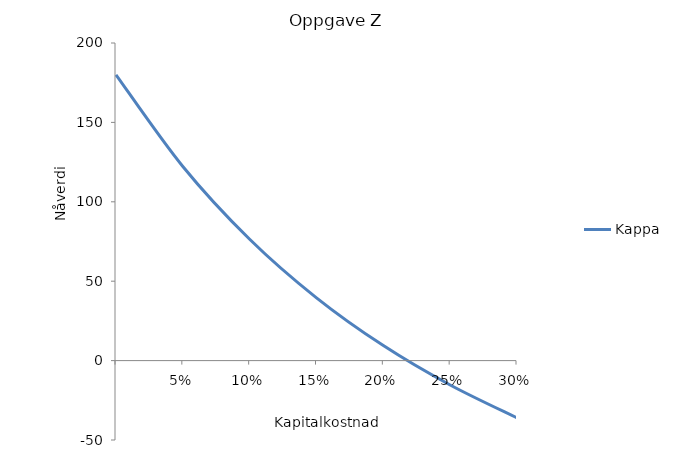
| Category | Kappa | Lambda |
|---|---|---|
| nan | 180 |  |
| 0.05 | 122.24 |  |
| 0.1 | 76.401 |  |
| 0.15000000000000002 | 39.51 |  |
| 0.2 | 9.437 |  |
| 0.25 | -15.366 |  |
| 0.3 | -36.044 |  |